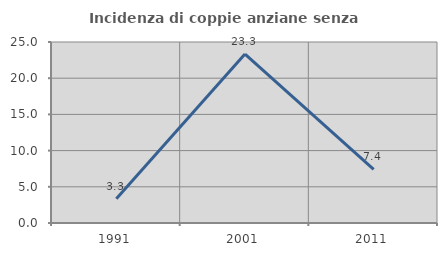
| Category | Incidenza di coppie anziane senza figli  |
|---|---|
| 1991.0 | 3.333 |
| 2001.0 | 23.333 |
| 2011.0 | 7.407 |